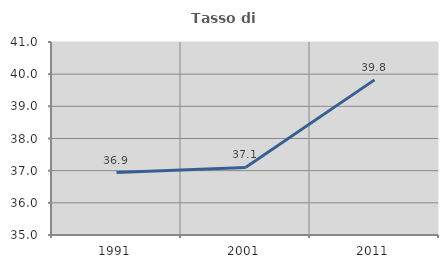
| Category | Tasso di occupazione   |
|---|---|
| 1991.0 | 36.942 |
| 2001.0 | 37.1 |
| 2011.0 | 39.822 |